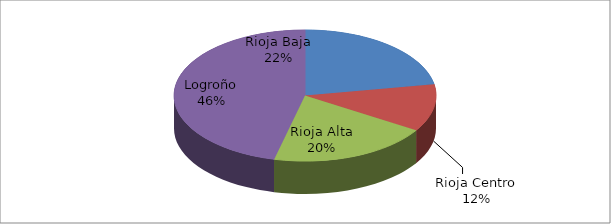
| Category | Series 0 |
|---|---|
| Rioja Baja | 1230 |
| Rioja Centro | 642 |
| Rioja Alta | 1098 |
| Logroño | 2553 |